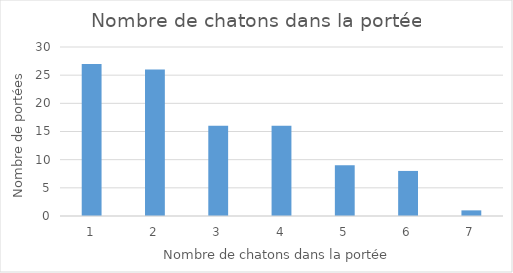
| Category | Series 0 |
|---|---|
| 1.0 | 27 |
| 2.0 | 26 |
| 3.0 | 16 |
| 4.0 | 16 |
| 5.0 | 9 |
| 6.0 | 8 |
| 7.0 | 1 |